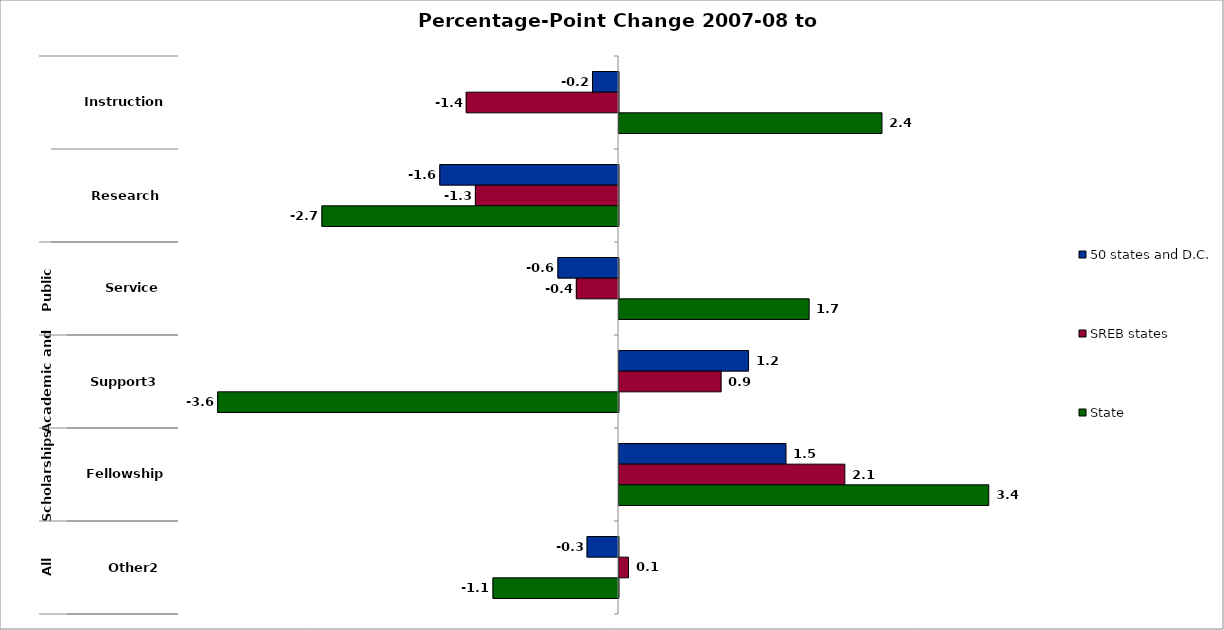
| Category | 50 states and D.C. | SREB states | State |
|---|---|---|---|
| 0 | -0.236 | -1.384 | 2.391 |
| 1 | -1.624 | -1.301 | -2.696 |
| 2 | -0.55 | -0.383 | 1.729 |
| 3 | 1.178 | 0.929 | -3.644 |
| 4 | 1.518 | 2.053 | 3.361 |
| 5 | -0.285 | 0.086 | -1.141 |